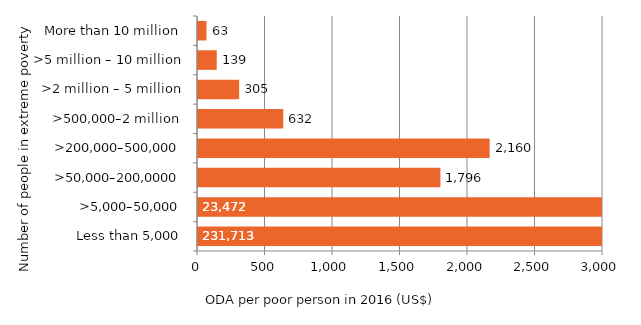
| Category | Series 0 |
|---|---|
| Less than 5,000 | 231713.218 |
| >5,000–50,000 | 23472.272 |
| >50,000–200,0000 | 1795.706 |
| >200,000–500,000 | 2160.314 |
| >500,000–2 million | 631.719 |
| >2 million – 5 million | 304.646 |
| >5 million – 10 million | 138.758 |
| More than 10 million | 63.09 |